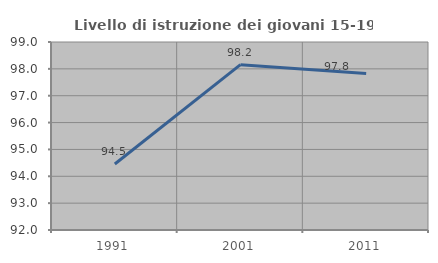
| Category | Livello di istruzione dei giovani 15-19 anni |
|---|---|
| 1991.0 | 94.458 |
| 2001.0 | 98.156 |
| 2011.0 | 97.829 |